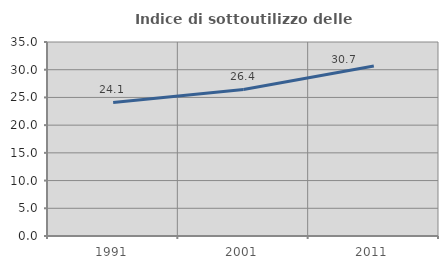
| Category | Indice di sottoutilizzo delle abitazioni  |
|---|---|
| 1991.0 | 24.09 |
| 2001.0 | 26.442 |
| 2011.0 | 30.658 |